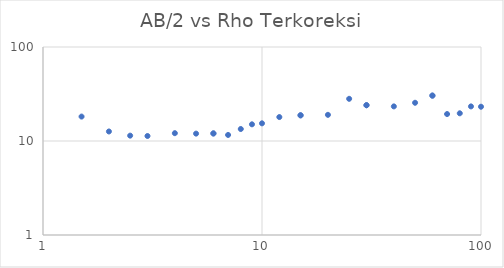
| Category | Series 0 |
|---|---|
| 1.5 | 18.191 |
| 2.0 | 12.627 |
| 2.5 | 11.401 |
| 3.0 | 11.303 |
| 4.0 | 12.113 |
| 5.0 | 11.98 |
| 6.0 | 12.034 |
| 6.0 | 12.034 |
| 7.0 | 11.598 |
| 8.0 | 13.415 |
| 9.0 | 15.048 |
| 10.0 | 15.416 |
| 12.0 | 17.978 |
| 15.0 | 18.757 |
| 15.0 | 18.757 |
| 20.0 | 18.979 |
| 25.0 | 28.102 |
| 30.0 | 24.024 |
| 30.0 | 24.024 |
| 40.0 | 23.345 |
| 50.0 | 25.51 |
| 60.0 | 30.407 |
| 60.0 | 30.407 |
| 70.0 | 19.355 |
| 80.0 | 19.712 |
| 90.0 | 23.336 |
| 100.0 | 23.149 |